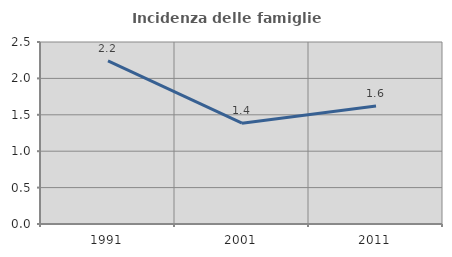
| Category | Incidenza delle famiglie numerose |
|---|---|
| 1991.0 | 2.241 |
| 2001.0 | 1.385 |
| 2011.0 | 1.622 |